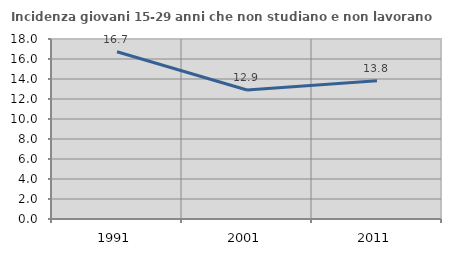
| Category | Incidenza giovani 15-29 anni che non studiano e non lavorano  |
|---|---|
| 1991.0 | 16.725 |
| 2001.0 | 12.903 |
| 2011.0 | 13.816 |